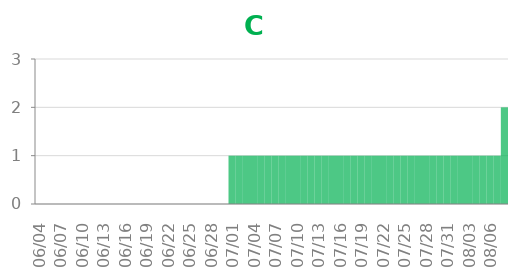
| Category | C |
|---|---|
| 2014-06-04 | 0 |
| 2014-06-05 | 0 |
| 2014-06-06 | 0 |
| 2014-06-07 | 0 |
| 2014-06-08 | 0 |
| 2014-06-09 | 0 |
| 2014-06-10 | 0 |
| 2014-06-11 | 0 |
| 2014-06-12 | 0 |
| 2014-06-13 | 0 |
| 2014-06-14 | 0 |
| 2014-06-15 | 0 |
| 2014-06-16 | 0 |
| 2014-06-17 | 0 |
| 2014-06-18 | 0 |
| 2014-06-19 | 0 |
| 2014-06-20 | 0 |
| 2014-06-21 | 0 |
| 2014-06-22 | 0 |
| 2014-06-23 | 0 |
| 2014-06-24 | 0 |
| 2014-06-25 | 0 |
| 2014-06-26 | 0 |
| 2014-06-27 | 0 |
| 2014-06-28 | 0 |
| 2014-06-29 | 0 |
| 2014-06-30 | 0 |
| 2014-07-01 | 1 |
| 2014-07-02 | 1 |
| 2014-07-03 | 1 |
| 2014-07-04 | 1 |
| 2014-07-05 | 1 |
| 2014-07-06 | 1 |
| 2014-07-07 | 1 |
| 2014-07-08 | 1 |
| 2014-07-09 | 1 |
| 2014-07-10 | 1 |
| 2014-07-11 | 1 |
| 2014-07-12 | 1 |
| 2014-07-13 | 1 |
| 2014-07-14 | 1 |
| 2014-07-15 | 1 |
| 2014-07-16 | 1 |
| 2014-07-17 | 1 |
| 2014-07-18 | 1 |
| 2014-07-19 | 1 |
| 2014-07-20 | 1 |
| 2014-07-21 | 1 |
| 2014-07-22 | 1 |
| 2014-07-23 | 1 |
| 2014-07-24 | 1 |
| 2014-07-25 | 1 |
| 2014-07-26 | 1 |
| 2014-07-27 | 1 |
| 2014-07-28 | 1 |
| 2014-07-29 | 1 |
| 2014-07-30 | 1 |
| 2014-07-31 | 1 |
| 2014-08-01 | 1 |
| 2014-08-02 | 1 |
| 2014-08-03 | 1 |
| 2014-08-04 | 1 |
| 2014-08-05 | 1 |
| 2014-08-06 | 1 |
| 2014-08-07 | 1 |
| 2014-08-08 | 2 |